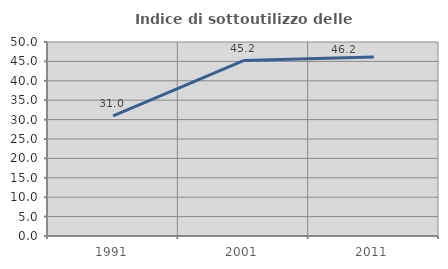
| Category | Indice di sottoutilizzo delle abitazioni  |
|---|---|
| 1991.0 | 30.968 |
| 2001.0 | 45.213 |
| 2011.0 | 46.154 |